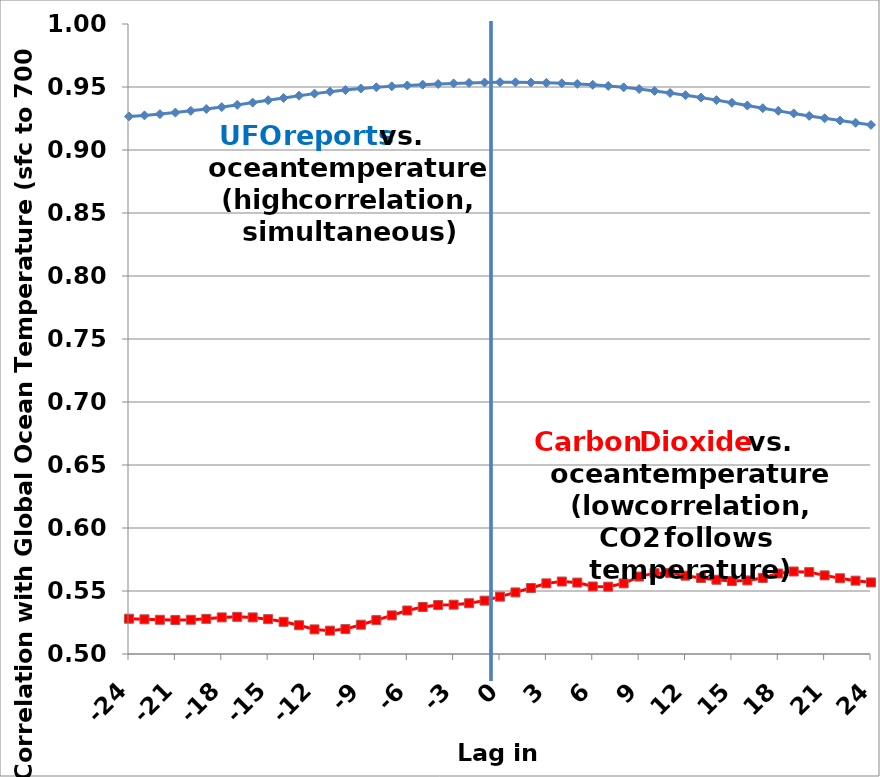
| Category | Series 0 | Series 1 |
|---|---|---|
| -24.0 | 0.927 | 0.528 |
| -23.0 | 0.927 | 0.528 |
| -22.0 | 0.928 | 0.527 |
| -21.0 | 0.93 | 0.527 |
| -20.0 | 0.931 | 0.527 |
| -19.0 | 0.933 | 0.528 |
| -18.0 | 0.934 | 0.529 |
| -17.0 | 0.936 | 0.529 |
| -16.0 | 0.938 | 0.529 |
| -15.0 | 0.939 | 0.528 |
| -14.0 | 0.941 | 0.526 |
| -13.0 | 0.943 | 0.523 |
| -12.0 | 0.945 | 0.52 |
| -11.0 | 0.946 | 0.519 |
| -10.0 | 0.948 | 0.52 |
| -9.0 | 0.949 | 0.523 |
| -8.0 | 0.95 | 0.527 |
| -7.0 | 0.951 | 0.531 |
| -6.0 | 0.951 | 0.535 |
| -5.0 | 0.952 | 0.537 |
| -4.0 | 0.952 | 0.539 |
| -3.0 | 0.953 | 0.539 |
| -2.0 | 0.953 | 0.54 |
| -1.0 | 0.954 | 0.542 |
| 0.0 | 0.954 | 0.546 |
| 1.0 | 0.954 | 0.549 |
| 2.0 | 0.954 | 0.552 |
| 3.0 | 0.953 | 0.556 |
| 4.0 | 0.953 | 0.558 |
| 5.0 | 0.952 | 0.557 |
| 6.0 | 0.952 | 0.554 |
| 7.0 | 0.951 | 0.553 |
| 8.0 | 0.95 | 0.556 |
| 9.0 | 0.948 | 0.561 |
| 10.0 | 0.947 | 0.564 |
| 11.0 | 0.945 | 0.564 |
| 12.0 | 0.943 | 0.562 |
| 13.0 | 0.942 | 0.56 |
| 14.0 | 0.94 | 0.559 |
| 15.0 | 0.937 | 0.558 |
| 16.0 | 0.935 | 0.558 |
| 17.0 | 0.933 | 0.56 |
| 18.0 | 0.931 | 0.564 |
| 19.0 | 0.929 | 0.565 |
| 20.0 | 0.927 | 0.565 |
| 21.0 | 0.925 | 0.562 |
| 22.0 | 0.923 | 0.56 |
| 23.0 | 0.922 | 0.558 |
| 24.0 | 0.92 | 0.557 |